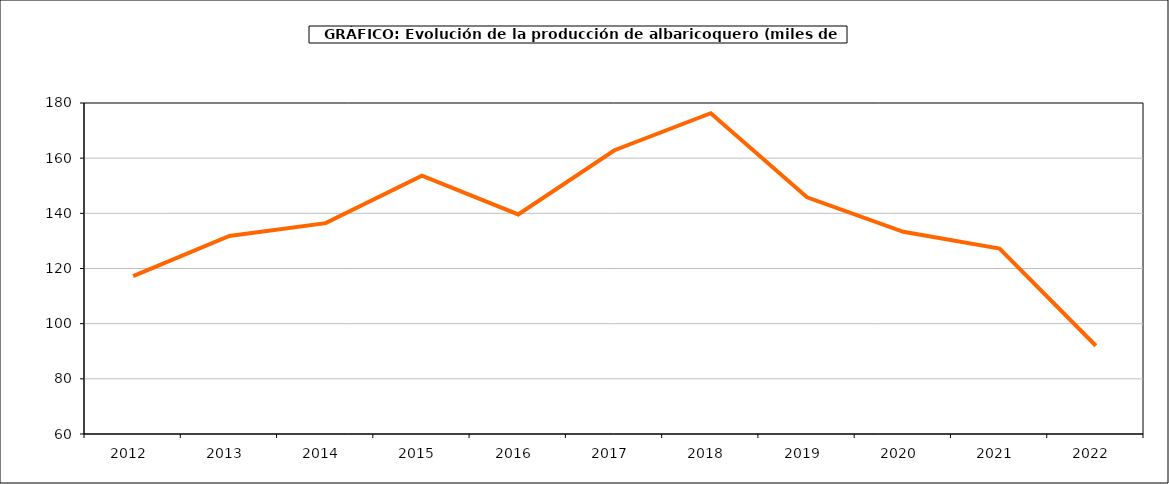
| Category | producción albaricoquero |
|---|---|
| 2012.0 | 117.24 |
| 2013.0 | 131.776 |
| 2014.0 | 136.446 |
| 2015.0 | 153.667 |
| 2016.0 | 139.605 |
| 2017.0 | 162.872 |
| 2018.0 | 176.289 |
| 2019.0 | 145.826 |
| 2020.0 | 133.296 |
| 2021.0 | 127.231 |
| 2022.0 | 91.984 |